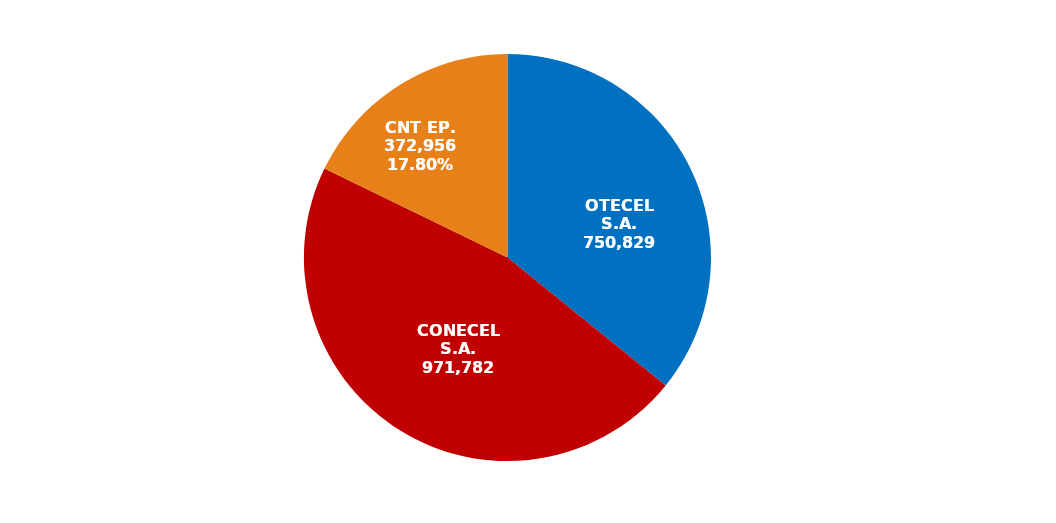
| Category | Series 0 |
|---|---|
| OTECEL S.A. | 750829 |
| CONECEL S.A. | 971782 |
| CNT EP. | 372956 |